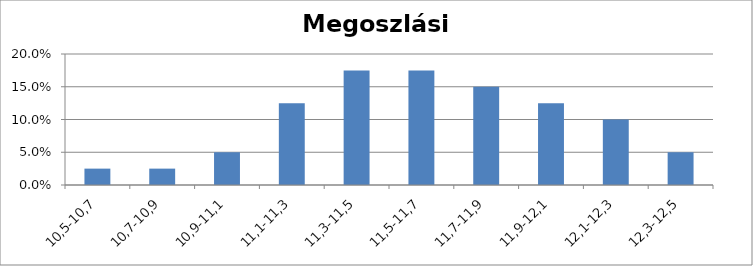
| Category | Series 0 |
|---|---|
| 10,5-10,7 | 0.025 |
| 10,7-10,9 | 0.025 |
| 10,9-11,1 | 0.05 |
| 11,1-11,3 | 0.125 |
| 11,3-11,5 | 0.175 |
| 11,5-11,7 | 0.175 |
| 11,7-11,9 | 0.15 |
| 11,9-12,1 | 0.125 |
| 12,1-12,3 | 0.1 |
| 12,3-12,5 | 0.05 |